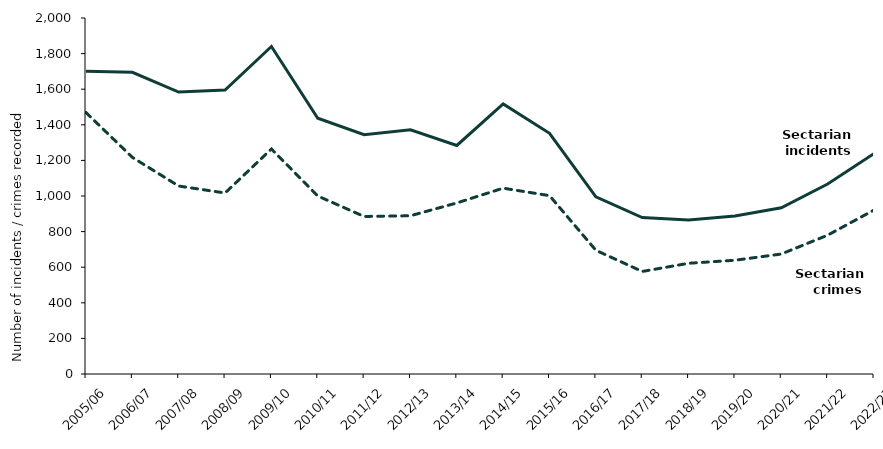
| Category | Sectarian incidents | Sectarian crimes |
|---|---|---|
| 2005/06 | 1701 | 1469 |
| 2006/07 | 1695 | 1217 |
| 2007/08 | 1584 | 1056 |
| 2008/09 | 1595 | 1017 |
| 2009/10 | 1840 | 1264 |
| 2010/11 | 1437 | 1000 |
| 2011/12 | 1344 | 885 |
| 2012/13 | 1372 | 889 |
| 2013/14 | 1284 | 961 |
| 2014/15 | 1517 | 1044 |
| 2015/16 | 1352 | 1002 |
| 2016/17 | 995 | 695 |
| 2017/18 | 879 | 576 |
| 2018/19 | 865 | 622 |
| 2019/20 | 888 | 639 |
| 2020/21 | 934 | 674 |
| 2021/22 | 1067 | 780 |
| 2022/23 | 1238 | 921 |